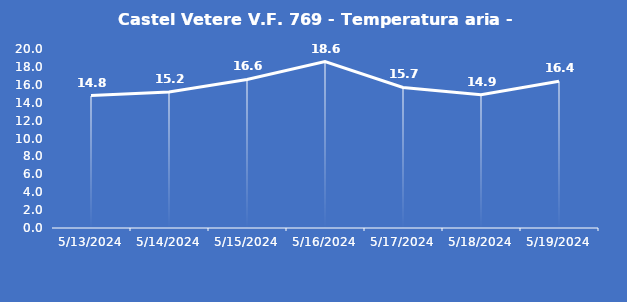
| Category | Castel Vetere V.F. 769 - Temperatura aria - Grezzo (°C) |
|---|---|
| 5/13/24 | 14.8 |
| 5/14/24 | 15.2 |
| 5/15/24 | 16.6 |
| 5/16/24 | 18.6 |
| 5/17/24 | 15.7 |
| 5/18/24 | 14.9 |
| 5/19/24 | 16.4 |